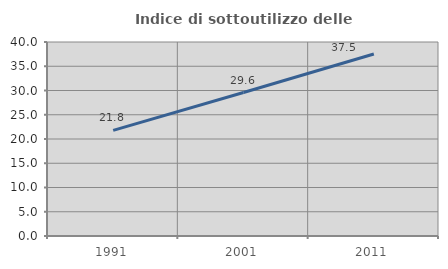
| Category | Indice di sottoutilizzo delle abitazioni  |
|---|---|
| 1991.0 | 21.782 |
| 2001.0 | 29.588 |
| 2011.0 | 37.525 |